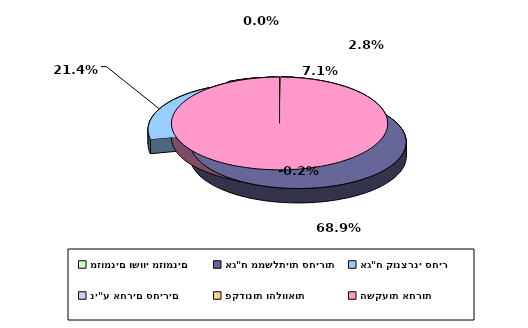
| Category | Series 0 |
|---|---|
| מזומנים ושווי מזומנים | 0.028 |
| אג"ח ממשלתיות סחירות | 0.689 |
| אג"ח קונצרני סחיר | 0.214 |
| ני"ע אחרים סחירים | 0.071 |
| פקדונות והלוואות | 0 |
| השקעות אחרות | -0.002 |